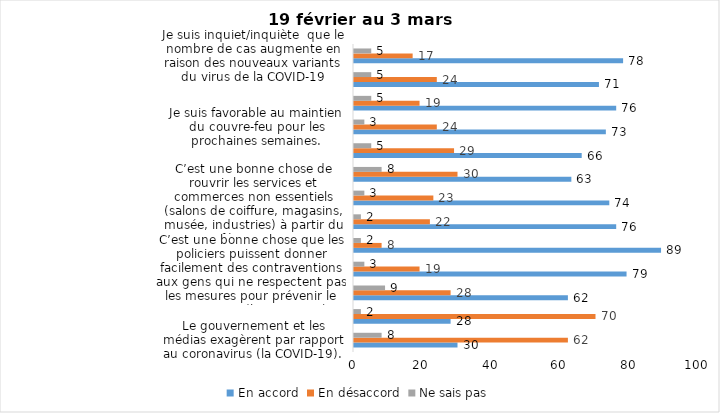
| Category | En accord | En désaccord | Ne sais pas |
|---|---|---|---|
| Le gouvernement et les médias exagèrent par rapport au coronavirus (la COVID-19). | 30 | 62 | 8 |
| Il est exagéré de rester chez soi pour se protéger contre le coronavirus (la COVID-19). | 28 | 70 | 2 |
| Les jeunes ne respectent pas les règles de confinement et contribuent à propager la COVID-19. | 62 | 28 | 9 |
| C’est une bonne chose que les policiers puissent donner facilement des contraventions aux gens qui ne respectent pas les mesures pour prévenir le coronavirus (la COVID-19). | 79 | 19 | 3 |
| La frontière entre le Canada et les États-Unis devrait être fermée au moins jusqu’en avril 2021. | 89 | 8 | 2 |
| Je suis favorable au port du masque ou du couvre-visage dans les
lieux publics extérieurs achalandés (ex. rues, parcs) | 76 | 22 | 2 |
| C’est une bonne chose de rouvrir les services et commerces non essentiels (salons de coiffure, magasins, musée, industries) à partir du 8 février 2021. | 74 | 23 | 3 |
| J’ai peur que la reprise des cours en présentiel dans les cégeps et les universités génère une augmentation des cas de COVID-19. | 63 | 30 | 8 |
| Les activités extérieures en petits groupes sont sécuritaires pour éviter la propagation de la COVID-19. | 66 | 29 | 5 |
| Je suis favorable au maintien du couvre-feu pour les prochaines semaines. | 73 | 24 | 3 |
| Pour éviter la propagation de la COVID-19, le gouvernement devrait maintenir des mesures préventives plus strictes pour la grande région de Montréal. | 76 | 19 | 5 |
| J’ai peur que le système de santé soit débordé par les cas de COVID-19 suite à l’assouplissement des mesures | 71 | 24 | 5 |
| Je suis inquiet/inquiète  que le nombre de cas augmente en raison des nouveaux variants du virus de la COVID-19 | 78 | 17 | 5 |